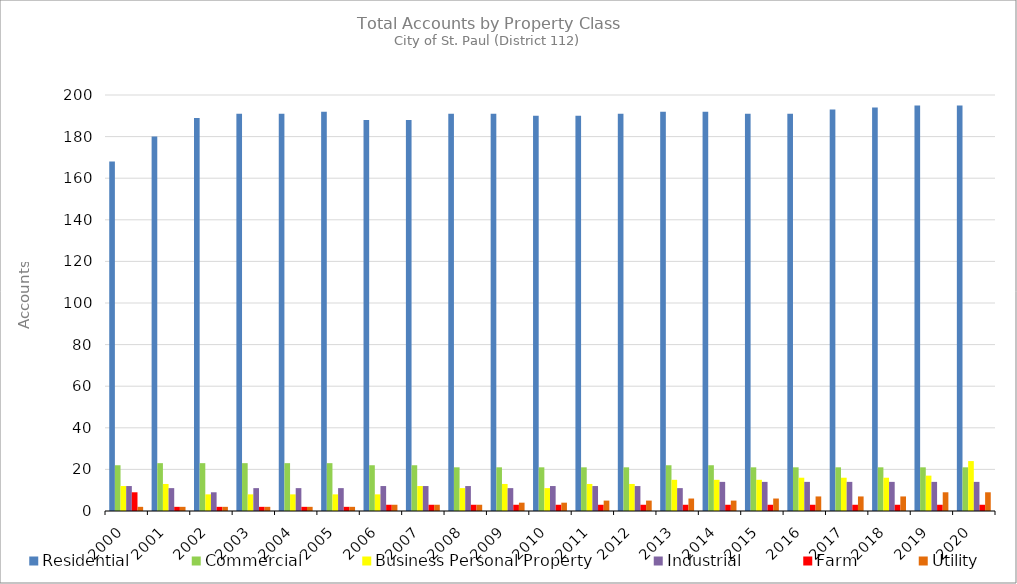
| Category | Residential | Commercial | Business Personal Property | Industrial | Farm | Utility |
|---|---|---|---|---|---|---|
| 2000.0 | 168 | 22 | 12 | 12 | 9 | 2 |
| 2001.0 | 180 | 23 | 13 | 11 | 2 | 2 |
| 2002.0 | 189 | 23 | 8 | 9 | 2 | 2 |
| 2003.0 | 191 | 23 | 8 | 11 | 2 | 2 |
| 2004.0 | 191 | 23 | 8 | 11 | 2 | 2 |
| 2005.0 | 192 | 23 | 8 | 11 | 2 | 2 |
| 2006.0 | 188 | 22 | 8 | 12 | 3 | 3 |
| 2007.0 | 188 | 22 | 12 | 12 | 3 | 3 |
| 2008.0 | 191 | 21 | 11 | 12 | 3 | 3 |
| 2009.0 | 191 | 21 | 13 | 11 | 3 | 4 |
| 2010.0 | 190 | 21 | 11 | 12 | 3 | 4 |
| 2011.0 | 190 | 21 | 13 | 12 | 3 | 5 |
| 2012.0 | 191 | 21 | 13 | 12 | 3 | 5 |
| 2013.0 | 192 | 22 | 15 | 11 | 3 | 6 |
| 2014.0 | 192 | 22 | 15 | 14 | 3 | 5 |
| 2015.0 | 191 | 21 | 15 | 14 | 3 | 6 |
| 2016.0 | 191 | 21 | 16 | 14 | 3 | 7 |
| 2017.0 | 193 | 21 | 16 | 14 | 3 | 7 |
| 2018.0 | 194 | 21 | 16 | 14 | 3 | 7 |
| 2019.0 | 195 | 21 | 17 | 14 | 3 | 9 |
| 2020.0 | 195 | 21 | 24 | 14 | 3 | 9 |